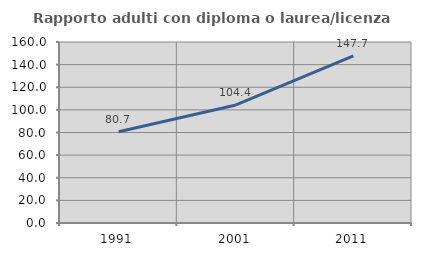
| Category | Rapporto adulti con diploma o laurea/licenza media  |
|---|---|
| 1991.0 | 80.734 |
| 2001.0 | 104.375 |
| 2011.0 | 147.714 |